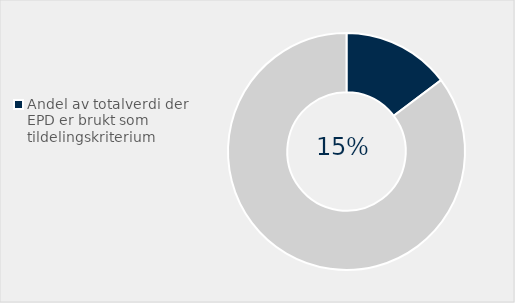
| Category | Series 0 |
|---|---|
| Andel av totalverdi der EPD er brukt som tildelingskriterium | 0.147 |
| Ikke brukt EPD som tildelingskritierum | 0.853 |